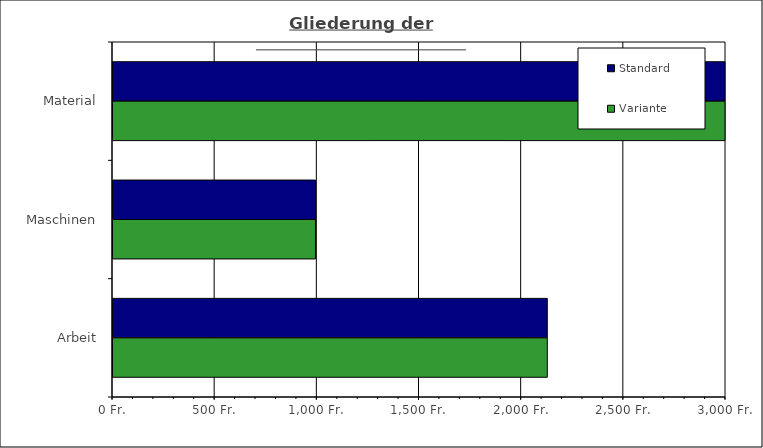
| Category | Standard | Variante  |
|---|---|---|
| Material | 4547.353 | 4547.353 |
| Maschinen | 991 | 991 |
| Arbeit | 2125.5 | 2125.5 |